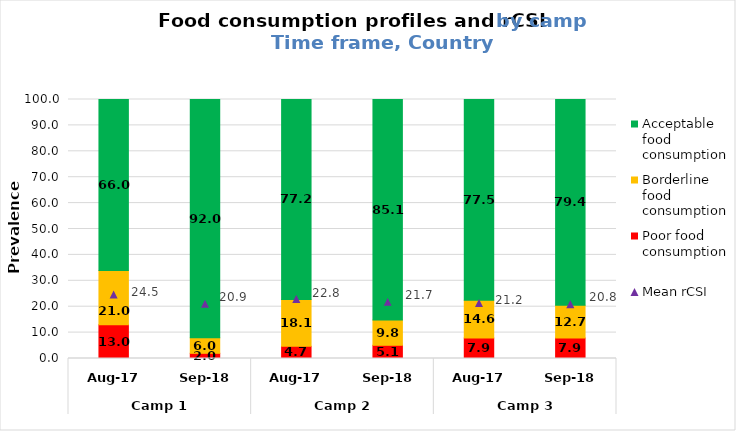
| Category | Poor food consumption | Borderline food consumption | Acceptable food consumption |
|---|---|---|---|
| 0 | 13 | 21 | 66 |
| 1 | 2 | 6 | 92 |
| 2 | 4.7 | 18.1 | 77.2 |
| 3 | 5.1 | 9.8 | 85.1 |
| 4 | 7.9 | 14.6 | 77.5 |
| 5 | 7.9 | 12.7 | 79.4 |